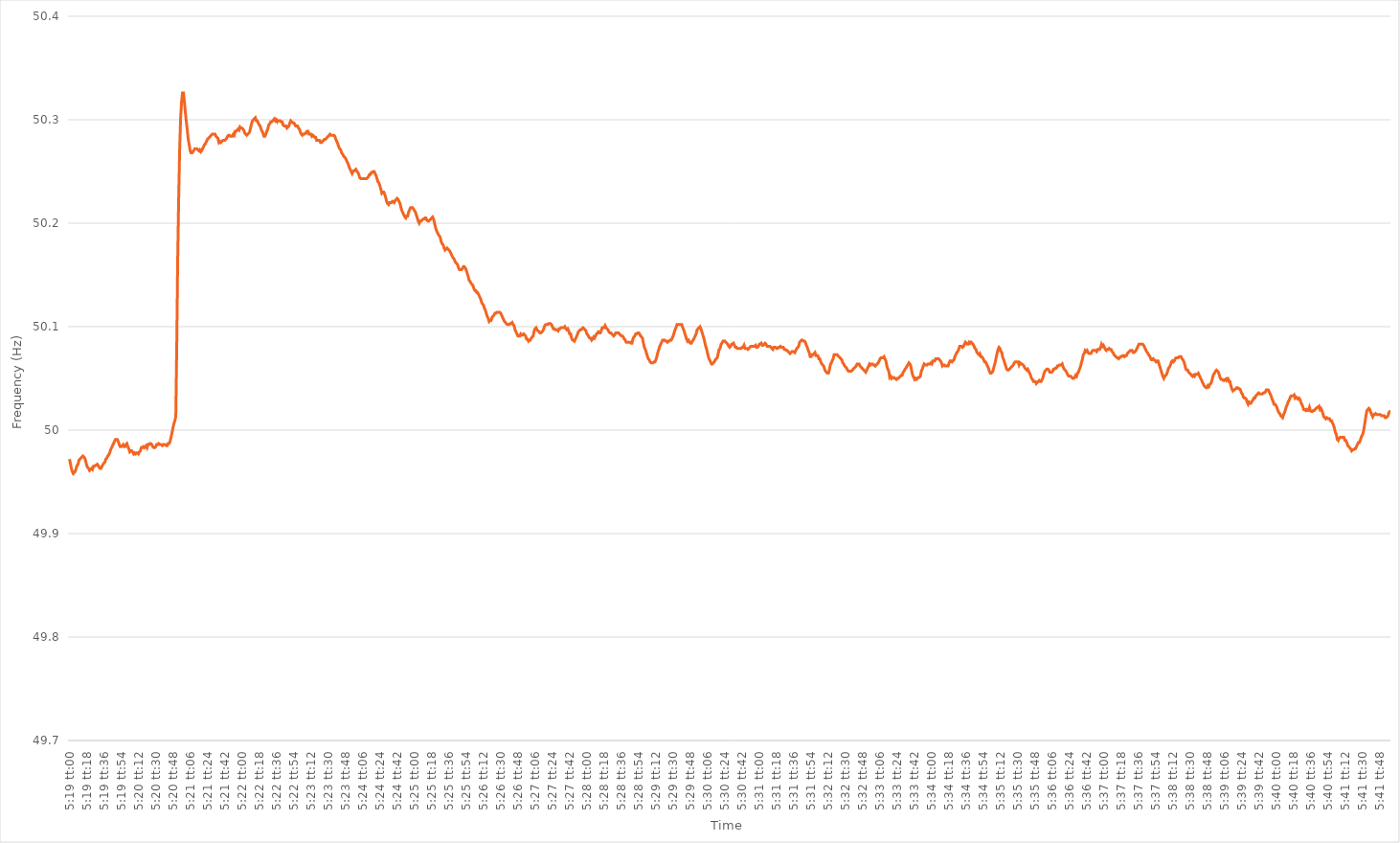
| Category | Series 0 |
|---|---|
| 0.22152777777777777 | 49.972 |
| 0.22153935185185183 | 49.968 |
| 0.22155092592592593 | 49.963 |
| 0.2215625 | 49.96 |
| 0.22157407407407406 | 49.958 |
| 0.22158564814814816 | 49.959 |
| 0.22159722222222222 | 49.96 |
| 0.2216087962962963 | 49.963 |
| 0.22162037037037038 | 49.966 |
| 0.22163194444444445 | 49.967 |
| 0.22164351851851852 | 49.971 |
| 0.2216550925925926 | 49.972 |
| 0.22166666666666668 | 49.973 |
| 0.22167824074074075 | 49.974 |
| 0.22168981481481484 | 49.975 |
| 0.2217013888888889 | 49.974 |
| 0.22171296296296295 | 49.973 |
| 0.221724537037037 | 49.97 |
| 0.2217361111111111 | 49.966 |
| 0.22174768518518517 | 49.964 |
| 0.22175925925925924 | 49.963 |
| 0.22177083333333333 | 49.961 |
| 0.2217824074074074 | 49.962 |
| 0.22179398148148147 | 49.963 |
| 0.22180555555555556 | 49.962 |
| 0.22181712962962963 | 49.965 |
| 0.2218287037037037 | 49.965 |
| 0.2218402777777778 | 49.966 |
| 0.22185185185185186 | 49.966 |
| 0.22186342592592592 | 49.967 |
| 0.22187500000000002 | 49.966 |
| 0.22188657407407408 | 49.964 |
| 0.22189814814814815 | 49.963 |
| 0.22190972222222224 | 49.963 |
| 0.2219212962962963 | 49.965 |
| 0.22193287037037038 | 49.967 |
| 0.22194444444444447 | 49.968 |
| 0.2219560185185185 | 49.969 |
| 0.22196759259259258 | 49.972 |
| 0.22197916666666664 | 49.973 |
| 0.22199074074074074 | 49.975 |
| 0.2220023148148148 | 49.976 |
| 0.22201388888888887 | 49.978 |
| 0.22202546296296297 | 49.981 |
| 0.22203703703703703 | 49.983 |
| 0.2220486111111111 | 49.985 |
| 0.2220601851851852 | 49.987 |
| 0.22207175925925926 | 49.989 |
| 0.22208333333333333 | 49.991 |
| 0.22209490740740742 | 49.991 |
| 0.2221064814814815 | 49.991 |
| 0.22211805555555555 | 49.989 |
| 0.22212962962962965 | 49.986 |
| 0.22214120370370372 | 49.984 |
| 0.22215277777777778 | 49.984 |
| 0.22216435185185188 | 49.985 |
| 0.22217592592592594 | 49.986 |
| 0.22218749999999998 | 49.984 |
| 0.22219907407407405 | 49.984 |
| 0.22221064814814814 | 49.986 |
| 0.2222222222222222 | 49.987 |
| 0.22223379629629628 | 49.984 |
| 0.22224537037037037 | 49.982 |
| 0.22225694444444444 | 49.979 |
| 0.2222685185185185 | 49.98 |
| 0.2222800925925926 | 49.98 |
| 0.22229166666666667 | 49.979 |
| 0.22230324074074073 | 49.977 |
| 0.22231481481481483 | 49.978 |
| 0.2223263888888889 | 49.977 |
| 0.22233796296296296 | 49.978 |
| 0.22234953703703705 | 49.978 |
| 0.22236111111111112 | 49.977 |
| 0.2223726851851852 | 49.979 |
| 0.22238425925925928 | 49.98 |
| 0.22239583333333335 | 49.983 |
| 0.22240740740740741 | 49.983 |
| 0.2224189814814815 | 49.984 |
| 0.22243055555555555 | 49.983 |
| 0.22244212962962961 | 49.984 |
| 0.22245370370370368 | 49.985 |
| 0.22246527777777778 | 49.983 |
| 0.22247685185185184 | 49.986 |
| 0.2224884259259259 | 49.986 |
| 0.2225 | 49.987 |
| 0.22251157407407407 | 49.987 |
| 0.22252314814814814 | 49.986 |
| 0.22253472222222223 | 49.984 |
| 0.2225462962962963 | 49.983 |
| 0.22255787037037036 | 49.983 |
| 0.22256944444444446 | 49.984 |
| 0.22258101851851853 | 49.986 |
| 0.2225925925925926 | 49.986 |
| 0.2226041666666667 | 49.987 |
| 0.22261574074074075 | 49.986 |
| 0.22262731481481482 | 49.986 |
| 0.22263888888888891 | 49.986 |
| 0.22265046296296298 | 49.985 |
| 0.22266203703703702 | 49.986 |
| 0.22267361111111109 | 49.986 |
| 0.22268518518518518 | 49.986 |
| 0.22269675925925925 | 49.985 |
| 0.2227083333333333 | 49.985 |
| 0.2227199074074074 | 49.987 |
| 0.22273148148148147 | 49.987 |
| 0.22274305555555554 | 49.989 |
| 0.22275462962962964 | 49.993 |
| 0.2227662037037037 | 49.997 |
| 0.22277777777777777 | 50.002 |
| 0.22278935185185186 | 50.006 |
| 0.22280092592592593 | 50.009 |
| 0.2228125 | 50.013 |
| 0.2228240740740741 | 50.081 |
| 0.22283564814814816 | 50.166 |
| 0.22284722222222222 | 50.223 |
| 0.22285879629629632 | 50.27 |
| 0.22287037037037039 | 50.301 |
| 0.22288194444444445 | 50.317 |
| 0.2228935185185185 | 50.326 |
| 0.22290509259259259 | 50.326 |
| 0.22291666666666665 | 50.317 |
| 0.22292824074074072 | 50.307 |
| 0.2229398148148148 | 50.298 |
| 0.22295138888888888 | 50.29 |
| 0.22296296296296295 | 50.281 |
| 0.22297453703703704 | 50.276 |
| 0.2229861111111111 | 50.27 |
| 0.22299768518518517 | 50.268 |
| 0.22300925925925927 | 50.268 |
| 0.22302083333333333 | 50.269 |
| 0.2230324074074074 | 50.271 |
| 0.2230439814814815 | 50.272 |
| 0.22305555555555556 | 50.272 |
| 0.22306712962962963 | 50.272 |
| 0.22307870370370372 | 50.271 |
| 0.2230902777777778 | 50.27 |
| 0.22310185185185186 | 50.271 |
| 0.22311342592592595 | 50.269 |
| 0.22312500000000002 | 50.27 |
| 0.22313657407407406 | 50.272 |
| 0.22314814814814812 | 50.274 |
| 0.22315972222222222 | 50.276 |
| 0.22317129629629628 | 50.277 |
| 0.22318287037037035 | 50.279 |
| 0.22319444444444445 | 50.281 |
| 0.2232060185185185 | 50.282 |
| 0.22321759259259258 | 50.283 |
| 0.22322916666666667 | 50.284 |
| 0.22324074074074074 | 50.285 |
| 0.2232523148148148 | 50.286 |
| 0.2232638888888889 | 50.286 |
| 0.22327546296296297 | 50.286 |
| 0.22328703703703703 | 50.286 |
| 0.22329861111111113 | 50.284 |
| 0.2233101851851852 | 50.283 |
| 0.22332175925925926 | 50.282 |
| 0.22333333333333336 | 50.278 |
| 0.22334490740740742 | 50.279 |
| 0.2233564814814815 | 50.278 |
| 0.22336805555555553 | 50.279 |
| 0.22337962962962962 | 50.28 |
| 0.2233912037037037 | 50.28 |
| 0.22340277777777776 | 50.28 |
| 0.22341435185185185 | 50.281 |
| 0.22342592592592592 | 50.282 |
| 0.22343749999999998 | 50.284 |
| 0.22344907407407408 | 50.285 |
| 0.22346064814814814 | 50.285 |
| 0.2234722222222222 | 50.284 |
| 0.2234837962962963 | 50.284 |
| 0.22349537037037037 | 50.284 |
| 0.22350694444444444 | 50.286 |
| 0.22351851851851853 | 50.285 |
| 0.2235300925925926 | 50.289 |
| 0.22354166666666667 | 50.289 |
| 0.22355324074074076 | 50.29 |
| 0.22356481481481483 | 50.291 |
| 0.2235763888888889 | 50.29 |
| 0.223587962962963 | 50.293 |
| 0.22359953703703705 | 50.292 |
| 0.2236111111111111 | 50.292 |
| 0.22362268518518516 | 50.291 |
| 0.22363425925925925 | 50.29 |
| 0.22364583333333332 | 50.287 |
| 0.2236574074074074 | 50.286 |
| 0.22366898148148148 | 50.285 |
| 0.22368055555555555 | 50.286 |
| 0.22369212962962962 | 50.287 |
| 0.2237037037037037 | 50.288 |
| 0.22371527777777778 | 50.292 |
| 0.22372685185185184 | 50.296 |
| 0.22373842592592594 | 50.299 |
| 0.22375 | 50.3 |
| 0.22376157407407407 | 50.301 |
| 0.22377314814814817 | 50.302 |
| 0.22378472222222223 | 50.299 |
| 0.2237962962962963 | 50.299 |
| 0.2238078703703704 | 50.297 |
| 0.22381944444444446 | 50.295 |
| 0.22383101851851853 | 50.294 |
| 0.22384259259259257 | 50.291 |
| 0.22385416666666666 | 50.289 |
| 0.22386574074074073 | 50.287 |
| 0.2238773148148148 | 50.284 |
| 0.2238888888888889 | 50.284 |
| 0.22390046296296295 | 50.286 |
| 0.22391203703703702 | 50.289 |
| 0.22392361111111111 | 50.291 |
| 0.22393518518518518 | 50.295 |
| 0.22394675925925925 | 50.296 |
| 0.22395833333333334 | 50.298 |
| 0.2239699074074074 | 50.298 |
| 0.22398148148148148 | 50.299 |
| 0.22399305555555557 | 50.3 |
| 0.22400462962962964 | 50.301 |
| 0.2240162037037037 | 50.299 |
| 0.2240277777777778 | 50.3 |
| 0.22403935185185186 | 50.298 |
| 0.22405092592592593 | 50.299 |
| 0.22406250000000003 | 50.299 |
| 0.2240740740740741 | 50.299 |
| 0.22408564814814813 | 50.298 |
| 0.2240972222222222 | 50.298 |
| 0.2241087962962963 | 50.295 |
| 0.22412037037037036 | 50.294 |
| 0.22413194444444443 | 50.294 |
| 0.22414351851851852 | 50.294 |
| 0.2241550925925926 | 50.292 |
| 0.22416666666666665 | 50.293 |
| 0.22417824074074075 | 50.294 |
| 0.22418981481481481 | 50.297 |
| 0.22420138888888888 | 50.299 |
| 0.22421296296296298 | 50.298 |
| 0.22422453703703704 | 50.297 |
| 0.2242361111111111 | 50.297 |
| 0.2242476851851852 | 50.296 |
| 0.22425925925925927 | 50.294 |
| 0.22427083333333334 | 50.294 |
| 0.22428240740740743 | 50.294 |
| 0.2242939814814815 | 50.292 |
| 0.22430555555555556 | 50.291 |
| 0.2243171296296296 | 50.288 |
| 0.2243287037037037 | 50.286 |
| 0.22434027777777776 | 50.285 |
| 0.22435185185185183 | 50.286 |
| 0.22436342592592592 | 50.286 |
| 0.224375 | 50.287 |
| 0.22438657407407406 | 50.287 |
| 0.22439814814814815 | 50.289 |
| 0.22440972222222222 | 50.289 |
| 0.22442129629629629 | 50.286 |
| 0.22443287037037038 | 50.286 |
| 0.22444444444444445 | 50.286 |
| 0.2244560185185185 | 50.284 |
| 0.2244675925925926 | 50.285 |
| 0.22447916666666667 | 50.284 |
| 0.22449074074074074 | 50.283 |
| 0.22450231481481484 | 50.283 |
| 0.2245138888888889 | 50.28 |
| 0.22452546296296297 | 50.28 |
| 0.22453703703703706 | 50.28 |
| 0.22454861111111113 | 50.28 |
| 0.22456018518518517 | 50.278 |
| 0.22457175925925923 | 50.278 |
| 0.22458333333333333 | 50.279 |
| 0.2245949074074074 | 50.28 |
| 0.22460648148148146 | 50.281 |
| 0.22461805555555556 | 50.281 |
| 0.22462962962962962 | 50.282 |
| 0.2246412037037037 | 50.283 |
| 0.22465277777777778 | 50.284 |
| 0.22466435185185185 | 50.285 |
| 0.22467592592592592 | 50.286 |
| 0.2246875 | 50.285 |
| 0.22469907407407408 | 50.285 |
| 0.22471064814814815 | 50.285 |
| 0.22472222222222224 | 50.285 |
| 0.2247337962962963 | 50.284 |
| 0.22474537037037037 | 50.281 |
| 0.22475694444444447 | 50.279 |
| 0.22476851851851853 | 50.277 |
| 0.2247800925925926 | 50.274 |
| 0.22479166666666664 | 50.272 |
| 0.22480324074074073 | 50.271 |
| 0.2248148148148148 | 50.268 |
| 0.22482638888888887 | 50.267 |
| 0.22483796296296296 | 50.265 |
| 0.22484953703703703 | 50.264 |
| 0.2248611111111111 | 50.263 |
| 0.2248726851851852 | 50.261 |
| 0.22488425925925926 | 50.259 |
| 0.22489583333333332 | 50.257 |
| 0.22490740740740742 | 50.254 |
| 0.22491898148148148 | 50.252 |
| 0.22493055555555555 | 50.25 |
| 0.22494212962962964 | 50.248 |
| 0.2249537037037037 | 50.25 |
| 0.22496527777777778 | 50.251 |
| 0.22497685185185187 | 50.251 |
| 0.22498842592592594 | 50.252 |
| 0.225 | 50.25 |
| 0.2250115740740741 | 50.249 |
| 0.22502314814814817 | 50.247 |
| 0.2250347222222222 | 50.244 |
| 0.22504629629629627 | 50.243 |
| 0.22505787037037037 | 50.243 |
| 0.22506944444444443 | 50.243 |
| 0.2250810185185185 | 50.243 |
| 0.2250925925925926 | 50.243 |
| 0.22510416666666666 | 50.243 |
| 0.22511574074074073 | 50.243 |
| 0.22512731481481482 | 50.244 |
| 0.2251388888888889 | 50.245 |
| 0.22515046296296296 | 50.247 |
| 0.22516203703703705 | 50.247 |
| 0.22517361111111112 | 50.249 |
| 0.22518518518518518 | 50.249 |
| 0.22519675925925928 | 50.25 |
| 0.22520833333333334 | 50.25 |
| 0.2252199074074074 | 50.248 |
| 0.2252314814814815 | 50.246 |
| 0.22524305555555557 | 50.243 |
| 0.22525462962962964 | 50.24 |
| 0.22526620370370368 | 50.239 |
| 0.22527777777777777 | 50.236 |
| 0.22528935185185184 | 50.233 |
| 0.2253009259259259 | 50.229 |
| 0.2253125 | 50.23 |
| 0.22532407407407407 | 50.23 |
| 0.22533564814814813 | 50.228 |
| 0.22534722222222223 | 50.225 |
| 0.2253587962962963 | 50.221 |
| 0.22537037037037036 | 50.219 |
| 0.22538194444444445 | 50.218 |
| 0.22539351851851852 | 50.22 |
| 0.2254050925925926 | 50.22 |
| 0.22541666666666668 | 50.22 |
| 0.22542824074074075 | 50.221 |
| 0.22543981481481482 | 50.221 |
| 0.2254513888888889 | 50.22 |
| 0.22546296296296298 | 50.222 |
| 0.22547453703703704 | 50.223 |
| 0.22548611111111114 | 50.224 |
| 0.22549768518518518 | 50.223 |
| 0.22550925925925924 | 50.221 |
| 0.2255208333333333 | 50.219 |
| 0.2255324074074074 | 50.215 |
| 0.22554398148148147 | 50.212 |
| 0.22555555555555554 | 50.21 |
| 0.22556712962962963 | 50.208 |
| 0.2255787037037037 | 50.206 |
| 0.22559027777777776 | 50.205 |
| 0.22560185185185186 | 50.207 |
| 0.22561342592592593 | 50.207 |
| 0.225625 | 50.211 |
| 0.2256365740740741 | 50.213 |
| 0.22564814814814815 | 50.215 |
| 0.22565972222222222 | 50.215 |
| 0.22567129629629631 | 50.215 |
| 0.22568287037037038 | 50.214 |
| 0.22569444444444445 | 50.212 |
| 0.22570601851851854 | 50.211 |
| 0.2257175925925926 | 50.208 |
| 0.22572916666666668 | 50.205 |
| 0.22574074074074071 | 50.202 |
| 0.2257523148148148 | 50.2 |
| 0.22576388888888888 | 50.202 |
| 0.22577546296296294 | 50.202 |
| 0.22578703703703704 | 50.203 |
| 0.2257986111111111 | 50.204 |
| 0.22581018518518517 | 50.204 |
| 0.22582175925925926 | 50.205 |
| 0.22583333333333333 | 50.205 |
| 0.2258449074074074 | 50.203 |
| 0.2258564814814815 | 50.202 |
| 0.22586805555555556 | 50.202 |
| 0.22587962962962962 | 50.203 |
| 0.22589120370370372 | 50.204 |
| 0.22590277777777779 | 50.205 |
| 0.22591435185185185 | 50.206 |
| 0.22592592592592595 | 50.204 |
| 0.2259375 | 50.2 |
| 0.22594907407407408 | 50.196 |
| 0.22596064814814817 | 50.193 |
| 0.2259722222222222 | 50.191 |
| 0.22598379629629628 | 50.189 |
| 0.22599537037037035 | 50.188 |
| 0.22600694444444444 | 50.186 |
| 0.2260185185185185 | 50.182 |
| 0.22603009259259257 | 50.18 |
| 0.22604166666666667 | 50.179 |
| 0.22605324074074074 | 50.176 |
| 0.2260648148148148 | 50.174 |
| 0.2260763888888889 | 50.175 |
| 0.22608796296296296 | 50.176 |
| 0.22609953703703703 | 50.175 |
| 0.22611111111111112 | 50.174 |
| 0.2261226851851852 | 50.173 |
| 0.22613425925925926 | 50.171 |
| 0.22614583333333335 | 50.169 |
| 0.22615740740740742 | 50.167 |
| 0.22616898148148148 | 50.166 |
| 0.22618055555555558 | 50.164 |
| 0.22619212962962965 | 50.162 |
| 0.2262037037037037 | 50.161 |
| 0.22621527777777775 | 50.16 |
| 0.22622685185185185 | 50.157 |
| 0.2262384259259259 | 50.155 |
| 0.22624999999999998 | 50.155 |
| 0.22626157407407407 | 50.155 |
| 0.22627314814814814 | 50.156 |
| 0.2262847222222222 | 50.158 |
| 0.2262962962962963 | 50.158 |
| 0.22630787037037037 | 50.157 |
| 0.22631944444444443 | 50.155 |
| 0.22633101851851853 | 50.152 |
| 0.2263425925925926 | 50.149 |
| 0.22635416666666666 | 50.145 |
| 0.22636574074074076 | 50.144 |
| 0.22637731481481482 | 50.142 |
| 0.2263888888888889 | 50.141 |
| 0.22640046296296298 | 50.14 |
| 0.22641203703703705 | 50.137 |
| 0.22642361111111112 | 50.135 |
| 0.2264351851851852 | 50.135 |
| 0.22644675925925925 | 50.133 |
| 0.22645833333333332 | 50.133 |
| 0.22646990740740738 | 50.131 |
| 0.22648148148148148 | 50.129 |
| 0.22649305555555554 | 50.127 |
| 0.2265046296296296 | 50.124 |
| 0.2265162037037037 | 50.122 |
| 0.22652777777777777 | 50.121 |
| 0.22653935185185184 | 50.118 |
| 0.22655092592592593 | 50.116 |
| 0.2265625 | 50.113 |
| 0.22657407407407407 | 50.11 |
| 0.22658564814814816 | 50.108 |
| 0.22659722222222223 | 50.105 |
| 0.2266087962962963 | 50.106 |
| 0.2266203703703704 | 50.106 |
| 0.22663194444444446 | 50.109 |
| 0.22664351851851852 | 50.11 |
| 0.22665509259259262 | 50.111 |
| 0.22666666666666668 | 50.113 |
| 0.22667824074074075 | 50.113 |
| 0.2266898148148148 | 50.114 |
| 0.22670138888888888 | 50.114 |
| 0.22671296296296295 | 50.114 |
| 0.22672453703703702 | 50.114 |
| 0.2267361111111111 | 50.113 |
| 0.22674768518518518 | 50.111 |
| 0.22675925925925924 | 50.109 |
| 0.22677083333333334 | 50.107 |
| 0.2267824074074074 | 50.105 |
| 0.22679398148148147 | 50.104 |
| 0.22680555555555557 | 50.103 |
| 0.22681712962962963 | 50.102 |
| 0.2268287037037037 | 50.102 |
| 0.2268402777777778 | 50.102 |
| 0.22685185185185186 | 50.103 |
| 0.22686342592592593 | 50.103 |
| 0.22687500000000002 | 50.104 |
| 0.2268865740740741 | 50.102 |
| 0.22689814814814815 | 50.101 |
| 0.22690972222222225 | 50.097 |
| 0.2269212962962963 | 50.095 |
| 0.22693287037037035 | 50.093 |
| 0.22694444444444442 | 50.091 |
| 0.22695601851851852 | 50.091 |
| 0.22696759259259258 | 50.091 |
| 0.22697916666666665 | 50.093 |
| 0.22699074074074074 | 50.092 |
| 0.2270023148148148 | 50.092 |
| 0.22701388888888888 | 50.093 |
| 0.22702546296296297 | 50.092 |
| 0.22703703703703704 | 50.091 |
| 0.2270486111111111 | 50.088 |
| 0.2270601851851852 | 50.088 |
| 0.22707175925925926 | 50.086 |
| 0.22708333333333333 | 50.087 |
| 0.22709490740740743 | 50.087 |
| 0.2271064814814815 | 50.089 |
| 0.22711805555555556 | 50.09 |
| 0.22712962962962965 | 50.091 |
| 0.22714120370370372 | 50.096 |
| 0.2271527777777778 | 50.098 |
| 0.22716435185185183 | 50.099 |
| 0.22717592592592592 | 50.097 |
| 0.2271875 | 50.096 |
| 0.22719907407407405 | 50.095 |
| 0.22721064814814815 | 50.094 |
| 0.22722222222222221 | 50.094 |
| 0.22723379629629628 | 50.095 |
| 0.22724537037037038 | 50.096 |
| 0.22725694444444444 | 50.098 |
| 0.2272685185185185 | 50.101 |
| 0.2272800925925926 | 50.102 |
| 0.22729166666666667 | 50.102 |
| 0.22730324074074074 | 50.102 |
| 0.22731481481481483 | 50.103 |
| 0.2273263888888889 | 50.103 |
| 0.22733796296296296 | 50.103 |
| 0.22734953703703706 | 50.102 |
| 0.22736111111111112 | 50.1 |
| 0.2273726851851852 | 50.098 |
| 0.22738425925925929 | 50.098 |
| 0.22739583333333332 | 50.097 |
| 0.2274074074074074 | 50.097 |
| 0.22741898148148146 | 50.097 |
| 0.22743055555555555 | 50.096 |
| 0.22744212962962962 | 50.098 |
| 0.22745370370370369 | 50.098 |
| 0.22746527777777778 | 50.099 |
| 0.22747685185185185 | 50.099 |
| 0.2274884259259259 | 50.099 |
| 0.2275 | 50.099 |
| 0.22751157407407407 | 50.1 |
| 0.22752314814814814 | 50.098 |
| 0.22753472222222224 | 50.097 |
| 0.2275462962962963 | 50.098 |
| 0.22755787037037037 | 50.096 |
| 0.22756944444444446 | 50.093 |
| 0.22758101851851853 | 50.093 |
| 0.2275925925925926 | 50.089 |
| 0.2276041666666667 | 50.087 |
| 0.22761574074074076 | 50.087 |
| 0.22762731481481482 | 50.086 |
| 0.22763888888888886 | 50.088 |
| 0.22765046296296296 | 50.09 |
| 0.22766203703703702 | 50.092 |
| 0.2276736111111111 | 50.095 |
| 0.22768518518518518 | 50.096 |
| 0.22769675925925925 | 50.097 |
| 0.22770833333333332 | 50.097 |
| 0.2277199074074074 | 50.098 |
| 0.22773148148148148 | 50.099 |
| 0.22774305555555555 | 50.098 |
| 0.22775462962962964 | 50.097 |
| 0.2277662037037037 | 50.096 |
| 0.22777777777777777 | 50.093 |
| 0.22778935185185187 | 50.092 |
| 0.22780092592592593 | 50.09 |
| 0.2278125 | 50.089 |
| 0.2278240740740741 | 50.089 |
| 0.22783564814814816 | 50.087 |
| 0.22784722222222223 | 50.088 |
| 0.22785879629629632 | 50.09 |
| 0.22787037037037036 | 50.089 |
| 0.22788194444444443 | 50.091 |
| 0.2278935185185185 | 50.093 |
| 0.2279050925925926 | 50.094 |
| 0.22791666666666666 | 50.095 |
| 0.22792824074074072 | 50.094 |
| 0.22793981481481482 | 50.094 |
| 0.22795138888888888 | 50.096 |
| 0.22796296296296295 | 50.099 |
| 0.22797453703703704 | 50.099 |
| 0.2279861111111111 | 50.099 |
| 0.22799768518518518 | 50.101 |
| 0.22800925925925927 | 50.099 |
| 0.22802083333333334 | 50.098 |
| 0.2280324074074074 | 50.097 |
| 0.2280439814814815 | 50.095 |
| 0.22805555555555557 | 50.094 |
| 0.22806712962962963 | 50.094 |
| 0.22807870370370373 | 50.093 |
| 0.2280902777777778 | 50.092 |
| 0.22810185185185183 | 50.091 |
| 0.2281134259259259 | 50.092 |
| 0.228125 | 50.094 |
| 0.22813657407407406 | 50.094 |
| 0.22814814814814813 | 50.094 |
| 0.22815972222222222 | 50.094 |
| 0.2281712962962963 | 50.093 |
| 0.22818287037037036 | 50.092 |
| 0.22819444444444445 | 50.091 |
| 0.22820601851851852 | 50.091 |
| 0.22821759259259258 | 50.09 |
| 0.22822916666666668 | 50.088 |
| 0.22824074074074074 | 50.087 |
| 0.2282523148148148 | 50.085 |
| 0.2282638888888889 | 50.085 |
| 0.22827546296296297 | 50.085 |
| 0.22828703703703704 | 50.085 |
| 0.22829861111111113 | 50.085 |
| 0.2283101851851852 | 50.084 |
| 0.22832175925925927 | 50.084 |
| 0.22833333333333336 | 50.088 |
| 0.2283449074074074 | 50.09 |
| 0.22835648148148147 | 50.091 |
| 0.22836805555555553 | 50.093 |
| 0.22837962962962963 | 50.093 |
| 0.2283912037037037 | 50.094 |
| 0.22840277777777776 | 50.094 |
| 0.22841435185185185 | 50.093 |
| 0.22842592592592592 | 50.091 |
| 0.2284375 | 50.09 |
| 0.22844907407407408 | 50.089 |
| 0.22846064814814815 | 50.084 |
| 0.22847222222222222 | 50.08 |
| 0.2284837962962963 | 50.078 |
| 0.22849537037037038 | 50.075 |
| 0.22850694444444444 | 50.072 |
| 0.22851851851851854 | 50.069 |
| 0.2285300925925926 | 50.068 |
| 0.22854166666666667 | 50.066 |
| 0.22855324074074077 | 50.065 |
| 0.22856481481481483 | 50.065 |
| 0.22857638888888887 | 50.065 |
| 0.22858796296296294 | 50.066 |
| 0.22859953703703703 | 50.066 |
| 0.2286111111111111 | 50.068 |
| 0.22862268518518516 | 50.071 |
| 0.22863425925925926 | 50.075 |
| 0.22864583333333333 | 50.078 |
| 0.2286574074074074 | 50.081 |
| 0.2286689814814815 | 50.083 |
| 0.22868055555555555 | 50.085 |
| 0.22869212962962962 | 50.087 |
| 0.22870370370370371 | 50.087 |
| 0.22871527777777778 | 50.087 |
| 0.22872685185185185 | 50.086 |
| 0.22873842592592594 | 50.086 |
| 0.22875 | 50.085 |
| 0.22876157407407408 | 50.086 |
| 0.22877314814814817 | 50.086 |
| 0.22878472222222224 | 50.087 |
| 0.2287962962962963 | 50.087 |
| 0.2288078703703704 | 50.089 |
| 0.22881944444444444 | 50.091 |
| 0.2288310185185185 | 50.094 |
| 0.22884259259259257 | 50.097 |
| 0.22885416666666666 | 50.099 |
| 0.22886574074074073 | 50.102 |
| 0.2288773148148148 | 50.102 |
| 0.2288888888888889 | 50.102 |
| 0.22890046296296296 | 50.102 |
| 0.22891203703703702 | 50.102 |
| 0.22892361111111112 | 50.102 |
| 0.22893518518518519 | 50.099 |
| 0.22894675925925925 | 50.097 |
| 0.22895833333333335 | 50.094 |
| 0.2289699074074074 | 50.091 |
| 0.22898148148148148 | 50.088 |
| 0.22899305555555557 | 50.086 |
| 0.22900462962962964 | 50.087 |
| 0.2290162037037037 | 50.085 |
| 0.2290277777777778 | 50.084 |
| 0.22903935185185187 | 50.084 |
| 0.2290509259259259 | 50.086 |
| 0.22906249999999997 | 50.087 |
| 0.22907407407407407 | 50.089 |
| 0.22908564814814814 | 50.091 |
| 0.2290972222222222 | 50.093 |
| 0.2291087962962963 | 50.097 |
| 0.22912037037037036 | 50.098 |
| 0.22913194444444443 | 50.099 |
| 0.22914351851851852 | 50.1 |
| 0.2291550925925926 | 50.098 |
| 0.22916666666666666 | 50.095 |
| 0.22917824074074075 | 50.092 |
| 0.22918981481481482 | 50.089 |
| 0.22920138888888889 | 50.085 |
| 0.22921296296296298 | 50.081 |
| 0.22922453703703705 | 50.078 |
| 0.2292361111111111 | 50.074 |
| 0.2292476851851852 | 50.07 |
| 0.22925925925925927 | 50.068 |
| 0.2292708333333333 | 50.066 |
| 0.22928240740740743 | 50.064 |
| 0.22929398148148147 | 50.064 |
| 0.22930555555555554 | 50.065 |
| 0.2293171296296296 | 50.066 |
| 0.2293287037037037 | 50.068 |
| 0.22934027777777777 | 50.069 |
| 0.22935185185185183 | 50.07 |
| 0.22936342592592593 | 50.074 |
| 0.229375 | 50.078 |
| 0.22938657407407406 | 50.079 |
| 0.22939814814814816 | 50.083 |
| 0.22940972222222222 | 50.084 |
| 0.2294212962962963 | 50.086 |
| 0.22943287037037038 | 50.086 |
| 0.22944444444444445 | 50.086 |
| 0.22945601851851852 | 50.085 |
| 0.2294675925925926 | 50.084 |
| 0.22947916666666668 | 50.083 |
| 0.22949074074074075 | 50.081 |
| 0.22950231481481484 | 50.08 |
| 0.22951388888888888 | 50.081 |
| 0.22952546296296297 | 50.083 |
| 0.229537037037037 | 50.083 |
| 0.2295486111111111 | 50.084 |
| 0.22956018518518517 | 50.082 |
| 0.22957175925925924 | 50.08 |
| 0.22958333333333333 | 50.08 |
| 0.2295949074074074 | 50.079 |
| 0.22960648148148147 | 50.079 |
| 0.22961805555555556 | 50.079 |
| 0.22962962962962963 | 50.079 |
| 0.2296412037037037 | 50.079 |
| 0.2296527777777778 | 50.08 |
| 0.22966435185185186 | 50.08 |
| 0.22967592592592592 | 50.082 |
| 0.22968750000000002 | 50.079 |
| 0.22969907407407408 | 50.079 |
| 0.22971064814814815 | 50.079 |
| 0.22972222222222224 | 50.078 |
| 0.2297337962962963 | 50.079 |
| 0.22974537037037038 | 50.08 |
| 0.22975694444444442 | 50.081 |
| 0.22976851851851854 | 50.081 |
| 0.22978009259259258 | 50.081 |
| 0.22979166666666664 | 50.081 |
| 0.22980324074074074 | 50.081 |
| 0.2298148148148148 | 50.082 |
| 0.22982638888888887 | 50.08 |
| 0.22983796296296297 | 50.08 |
| 0.22984953703703703 | 50.081 |
| 0.2298611111111111 | 50.083 |
| 0.2298726851851852 | 50.083 |
| 0.22988425925925926 | 50.084 |
| 0.22989583333333333 | 50.082 |
| 0.22990740740740742 | 50.082 |
| 0.2299189814814815 | 50.083 |
| 0.22993055555555555 | 50.084 |
| 0.22994212962962965 | 50.083 |
| 0.22995370370370372 | 50.081 |
| 0.22996527777777778 | 50.081 |
| 0.22997685185185188 | 50.081 |
| 0.22998842592592594 | 50.081 |
| 0.22999999999999998 | 50.08 |
| 0.23001157407407405 | 50.079 |
| 0.23002314814814814 | 50.078 |
| 0.2300347222222222 | 50.08 |
| 0.23004629629629628 | 50.08 |
| 0.23005787037037037 | 50.08 |
| 0.23006944444444444 | 50.079 |
| 0.2300810185185185 | 50.079 |
| 0.2300925925925926 | 50.08 |
| 0.23010416666666667 | 50.08 |
| 0.23011574074074073 | 50.081 |
| 0.23012731481481483 | 50.08 |
| 0.2301388888888889 | 50.08 |
| 0.23015046296296296 | 50.08 |
| 0.23016203703703705 | 50.078 |
| 0.23017361111111112 | 50.078 |
| 0.2301851851851852 | 50.077 |
| 0.23019675925925928 | 50.077 |
| 0.23020833333333335 | 50.076 |
| 0.2302199074074074 | 50.075 |
| 0.2302314814814815 | 50.074 |
| 0.23024305555555555 | 50.075 |
| 0.23025462962962961 | 50.076 |
| 0.23026620370370368 | 50.076 |
| 0.23027777777777778 | 50.076 |
| 0.23028935185185184 | 50.075 |
| 0.2303009259259259 | 50.077 |
| 0.2303125 | 50.079 |
| 0.23032407407407407 | 50.08 |
| 0.23033564814814814 | 50.081 |
| 0.23034722222222223 | 50.085 |
| 0.2303587962962963 | 50.086 |
| 0.23037037037037036 | 50.087 |
| 0.23038194444444446 | 50.087 |
| 0.23039351851851853 | 50.086 |
| 0.2304050925925926 | 50.086 |
| 0.2304166666666667 | 50.085 |
| 0.23042824074074075 | 50.082 |
| 0.23043981481481482 | 50.08 |
| 0.23045138888888891 | 50.077 |
| 0.23046296296296295 | 50.075 |
| 0.23047453703703705 | 50.071 |
| 0.23048611111111109 | 50.071 |
| 0.23049768518518518 | 50.073 |
| 0.23050925925925925 | 50.073 |
| 0.2305208333333333 | 50.074 |
| 0.2305324074074074 | 50.075 |
| 0.23054398148148147 | 50.072 |
| 0.23055555555555554 | 50.072 |
| 0.23056712962962964 | 50.072 |
| 0.2305787037037037 | 50.069 |
| 0.23059027777777777 | 50.069 |
| 0.23060185185185186 | 50.066 |
| 0.23061342592592593 | 50.064 |
| 0.230625 | 50.063 |
| 0.2306365740740741 | 50.062 |
| 0.23064814814814816 | 50.059 |
| 0.23065972222222222 | 50.057 |
| 0.23067129629629632 | 50.056 |
| 0.23068287037037036 | 50.055 |
| 0.23069444444444445 | 50.055 |
| 0.2307060185185185 | 50.058 |
| 0.2307175925925926 | 50.063 |
| 0.23072916666666665 | 50.065 |
| 0.23074074074074072 | 50.067 |
| 0.2307523148148148 | 50.069 |
| 0.23076388888888888 | 50.073 |
| 0.23077546296296295 | 50.073 |
| 0.23078703703703704 | 50.073 |
| 0.2307986111111111 | 50.073 |
| 0.23081018518518517 | 50.072 |
| 0.23082175925925927 | 50.071 |
| 0.23083333333333333 | 50.07 |
| 0.2308449074074074 | 50.069 |
| 0.2308564814814815 | 50.068 |
| 0.23086805555555556 | 50.065 |
| 0.23087962962962963 | 50.064 |
| 0.23089120370370372 | 50.062 |
| 0.2309027777777778 | 50.061 |
| 0.23091435185185186 | 50.06 |
| 0.2309259259259259 | 50.058 |
| 0.23093750000000002 | 50.057 |
| 0.23094907407407406 | 50.057 |
| 0.23096064814814818 | 50.057 |
| 0.23097222222222222 | 50.057 |
| 0.23098379629629628 | 50.058 |
| 0.23099537037037035 | 50.059 |
| 0.23100694444444445 | 50.06 |
| 0.2310185185185185 | 50.061 |
| 0.23103009259259258 | 50.062 |
| 0.23104166666666667 | 50.064 |
| 0.23105324074074074 | 50.064 |
| 0.2310648148148148 | 50.064 |
| 0.2310763888888889 | 50.062 |
| 0.23108796296296297 | 50.061 |
| 0.23109953703703703 | 50.06 |
| 0.23111111111111113 | 50.059 |
| 0.2311226851851852 | 50.058 |
| 0.23113425925925926 | 50.057 |
| 0.23114583333333336 | 50.056 |
| 0.23115740740740742 | 50.058 |
| 0.23116898148148146 | 50.06 |
| 0.23118055555555558 | 50.062 |
| 0.23119212962962962 | 50.064 |
| 0.2312037037037037 | 50.063 |
| 0.23121527777777776 | 50.064 |
| 0.23122685185185185 | 50.064 |
| 0.23123842592592592 | 50.063 |
| 0.23124999999999998 | 50.063 |
| 0.23126157407407408 | 50.062 |
| 0.23127314814814814 | 50.063 |
| 0.2312847222222222 | 50.064 |
| 0.2312962962962963 | 50.065 |
| 0.23130787037037037 | 50.067 |
| 0.23131944444444444 | 50.069 |
| 0.23133101851851853 | 50.07 |
| 0.2313425925925926 | 50.07 |
| 0.23135416666666667 | 50.07 |
| 0.23136574074074076 | 50.071 |
| 0.23137731481481483 | 50.069 |
| 0.2313888888888889 | 50.067 |
| 0.231400462962963 | 50.062 |
| 0.23141203703703703 | 50.059 |
| 0.23142361111111112 | 50.057 |
| 0.23143518518518516 | 50.051 |
| 0.23144675925925925 | 50.052 |
| 0.23145833333333332 | 50.05 |
| 0.2314699074074074 | 50.051 |
| 0.23148148148148148 | 50.051 |
| 0.23149305555555555 | 50.05 |
| 0.23150462962962962 | 50.05 |
| 0.2315162037037037 | 50.049 |
| 0.23152777777777778 | 50.05 |
| 0.23153935185185184 | 50.05 |
| 0.23155092592592594 | 50.051 |
| 0.2315625 | 50.052 |
| 0.23157407407407407 | 50.053 |
| 0.23158564814814817 | 50.053 |
| 0.23159722222222223 | 50.056 |
| 0.2316087962962963 | 50.057 |
| 0.2316203703703704 | 50.059 |
| 0.23163194444444443 | 50.06 |
| 0.23164351851851853 | 50.062 |
| 0.23165509259259257 | 50.063 |
| 0.2316666666666667 | 50.065 |
| 0.23167824074074073 | 50.064 |
| 0.2316898148148148 | 50.062 |
| 0.2317013888888889 | 50.057 |
| 0.23171296296296295 | 50.053 |
| 0.23172453703703702 | 50.051 |
| 0.23173611111111111 | 50.049 |
| 0.23174768518518518 | 50.05 |
| 0.23175925925925925 | 50.049 |
| 0.23177083333333334 | 50.05 |
| 0.2317824074074074 | 50.051 |
| 0.23179398148148148 | 50.051 |
| 0.23180555555555557 | 50.052 |
| 0.23181712962962964 | 50.057 |
| 0.2318287037037037 | 50.059 |
| 0.2318402777777778 | 50.062 |
| 0.23185185185185186 | 50.064 |
| 0.23186342592592593 | 50.063 |
| 0.23187499999999997 | 50.063 |
| 0.2318865740740741 | 50.063 |
| 0.23189814814814813 | 50.064 |
| 0.23190972222222225 | 50.064 |
| 0.2319212962962963 | 50.064 |
| 0.23193287037037036 | 50.065 |
| 0.23194444444444443 | 50.064 |
| 0.23195601851851852 | 50.067 |
| 0.2319675925925926 | 50.067 |
| 0.23197916666666665 | 50.067 |
| 0.23199074074074075 | 50.069 |
| 0.23200231481481481 | 50.069 |
| 0.23201388888888888 | 50.069 |
| 0.23202546296296298 | 50.069 |
| 0.23203703703703704 | 50.068 |
| 0.2320486111111111 | 50.067 |
| 0.2320601851851852 | 50.065 |
| 0.23207175925925927 | 50.062 |
| 0.23208333333333334 | 50.063 |
| 0.23209490740740743 | 50.063 |
| 0.2321064814814815 | 50.062 |
| 0.23211805555555554 | 50.062 |
| 0.23212962962962966 | 50.062 |
| 0.2321412037037037 | 50.062 |
| 0.23215277777777776 | 50.065 |
| 0.23216435185185183 | 50.067 |
| 0.23217592592592592 | 50.067 |
| 0.2321875 | 50.066 |
| 0.23219907407407406 | 50.067 |
| 0.23221064814814815 | 50.068 |
| 0.23222222222222222 | 50.071 |
| 0.23223379629629629 | 50.073 |
| 0.23224537037037038 | 50.075 |
| 0.23225694444444445 | 50.076 |
| 0.2322685185185185 | 50.078 |
| 0.2322800925925926 | 50.081 |
| 0.23229166666666667 | 50.081 |
| 0.23230324074074074 | 50.081 |
| 0.23231481481481484 | 50.08 |
| 0.2323263888888889 | 50.081 |
| 0.23233796296296297 | 50.083 |
| 0.23234953703703706 | 50.085 |
| 0.2323611111111111 | 50.084 |
| 0.2323726851851852 | 50.083 |
| 0.23238425925925923 | 50.083 |
| 0.23239583333333333 | 50.085 |
| 0.2324074074074074 | 50.084 |
| 0.23241898148148146 | 50.085 |
| 0.23243055555555556 | 50.084 |
| 0.23244212962962962 | 50.083 |
| 0.2324537037037037 | 50.081 |
| 0.23246527777777778 | 50.079 |
| 0.23247685185185185 | 50.078 |
| 0.23248842592592592 | 50.075 |
| 0.2325 | 50.074 |
| 0.23251157407407408 | 50.073 |
| 0.23252314814814815 | 50.074 |
| 0.23253472222222224 | 50.071 |
| 0.2325462962962963 | 50.071 |
| 0.23255787037037037 | 50.07 |
| 0.23256944444444447 | 50.068 |
| 0.2325810185185185 | 50.066 |
| 0.2325925925925926 | 50.066 |
| 0.23260416666666664 | 50.064 |
| 0.23261574074074076 | 50.062 |
| 0.2326273148148148 | 50.06 |
| 0.23263888888888887 | 50.057 |
| 0.23265046296296296 | 50.055 |
| 0.23266203703703703 | 50.055 |
| 0.2326736111111111 | 50.056 |
| 0.2326851851851852 | 50.058 |
| 0.23269675925925926 | 50.062 |
| 0.23270833333333332 | 50.065 |
| 0.23271990740740742 | 50.07 |
| 0.23273148148148148 | 50.074 |
| 0.23274305555555555 | 50.078 |
| 0.23275462962962964 | 50.08 |
| 0.2327662037037037 | 50.079 |
| 0.23277777777777778 | 50.076 |
| 0.23278935185185187 | 50.075 |
| 0.23280092592592594 | 50.07 |
| 0.2328125 | 50.068 |
| 0.23282407407407404 | 50.065 |
| 0.23283564814814817 | 50.062 |
| 0.2328472222222222 | 50.059 |
| 0.23285879629629633 | 50.058 |
| 0.23287037037037037 | 50.058 |
| 0.23288194444444443 | 50.059 |
| 0.2328935185185185 | 50.06 |
| 0.2329050925925926 | 50.061 |
| 0.23291666666666666 | 50.062 |
| 0.23292824074074073 | 50.063 |
| 0.23293981481481482 | 50.065 |
| 0.2329513888888889 | 50.066 |
| 0.23296296296296296 | 50.066 |
| 0.23297453703703705 | 50.066 |
| 0.23298611111111112 | 50.066 |
| 0.23299768518518518 | 50.063 |
| 0.23300925925925928 | 50.065 |
| 0.23302083333333334 | 50.064 |
| 0.2330324074074074 | 50.064 |
| 0.2330439814814815 | 50.063 |
| 0.23305555555555557 | 50.062 |
| 0.2330671296296296 | 50.06 |
| 0.23307870370370373 | 50.059 |
| 0.23309027777777777 | 50.058 |
| 0.23310185185185184 | 50.059 |
| 0.2331134259259259 | 50.057 |
| 0.233125 | 50.055 |
| 0.23313657407407407 | 50.053 |
| 0.23314814814814813 | 50.05 |
| 0.23315972222222223 | 50.049 |
| 0.2331712962962963 | 50.047 |
| 0.23318287037037036 | 50.047 |
| 0.23319444444444445 | 50.047 |
| 0.23320601851851852 | 50.045 |
| 0.2332175925925926 | 50.046 |
| 0.23322916666666668 | 50.047 |
| 0.23324074074074075 | 50.048 |
| 0.23325231481481482 | 50.047 |
| 0.2332638888888889 | 50.047 |
| 0.23327546296296298 | 50.049 |
| 0.23328703703703701 | 50.051 |
| 0.23329861111111114 | 50.055 |
| 0.23331018518518518 | 50.057 |
| 0.23332175925925927 | 50.058 |
| 0.2333333333333333 | 50.059 |
| 0.2333449074074074 | 50.059 |
| 0.23335648148148147 | 50.058 |
| 0.23336805555555554 | 50.056 |
| 0.23337962962962963 | 50.056 |
| 0.2333912037037037 | 50.056 |
| 0.23340277777777776 | 50.057 |
| 0.23341435185185186 | 50.059 |
| 0.23342592592592593 | 50.059 |
| 0.2334375 | 50.06 |
| 0.2334490740740741 | 50.06 |
| 0.23346064814814815 | 50.062 |
| 0.23347222222222222 | 50.062 |
| 0.23348379629629631 | 50.063 |
| 0.23349537037037038 | 50.063 |
| 0.23350694444444445 | 50.063 |
| 0.23351851851851854 | 50.064 |
| 0.23353009259259258 | 50.061 |
| 0.23354166666666668 | 50.059 |
| 0.23355324074074071 | 50.058 |
| 0.23356481481481484 | 50.057 |
| 0.23357638888888888 | 50.055 |
| 0.23358796296296294 | 50.053 |
| 0.23359953703703704 | 50.052 |
| 0.2336111111111111 | 50.052 |
| 0.23362268518518517 | 50.052 |
| 0.23363425925925926 | 50.051 |
| 0.23364583333333333 | 50.05 |
| 0.2336574074074074 | 50.05 |
| 0.2336689814814815 | 50.051 |
| 0.23368055555555556 | 50.053 |
| 0.23369212962962962 | 50.052 |
| 0.23370370370370372 | 50.055 |
| 0.23371527777777779 | 50.056 |
| 0.23372685185185185 | 50.059 |
| 0.23373842592592595 | 50.061 |
| 0.23375 | 50.065 |
| 0.23376157407407408 | 50.068 |
| 0.23377314814814812 | 50.073 |
| 0.23378472222222224 | 50.074 |
| 0.23379629629629628 | 50.077 |
| 0.23380787037037035 | 50.076 |
| 0.23381944444444444 | 50.077 |
| 0.2338310185185185 | 50.075 |
| 0.23384259259259257 | 50.074 |
| 0.23385416666666667 | 50.074 |
| 0.23386574074074074 | 50.074 |
| 0.2338773148148148 | 50.076 |
| 0.2338888888888889 | 50.077 |
| 0.23390046296296296 | 50.077 |
| 0.23391203703703703 | 50.077 |
| 0.23392361111111112 | 50.077 |
| 0.2339351851851852 | 50.076 |
| 0.23394675925925926 | 50.078 |
| 0.23395833333333335 | 50.078 |
| 0.23396990740740742 | 50.078 |
| 0.23398148148148148 | 50.08 |
| 0.23399305555555558 | 50.083 |
| 0.23400462962962965 | 50.081 |
| 0.23401620370370368 | 50.082 |
| 0.2340277777777778 | 50.08 |
| 0.23403935185185185 | 50.078 |
| 0.2340509259259259 | 50.077 |
| 0.23406249999999998 | 50.078 |
| 0.23407407407407407 | 50.078 |
| 0.23408564814814814 | 50.079 |
| 0.2340972222222222 | 50.078 |
| 0.2341087962962963 | 50.078 |
| 0.23412037037037037 | 50.076 |
| 0.23413194444444443 | 50.075 |
| 0.23414351851851853 | 50.073 |
| 0.2341550925925926 | 50.072 |
| 0.23416666666666666 | 50.071 |
| 0.23417824074074076 | 50.07 |
| 0.23418981481481482 | 50.07 |
| 0.2342013888888889 | 50.069 |
| 0.23421296296296298 | 50.07 |
| 0.23422453703703705 | 50.071 |
| 0.2342361111111111 | 50.071 |
| 0.2342476851851852 | 50.072 |
| 0.23425925925925925 | 50.072 |
| 0.23427083333333334 | 50.071 |
| 0.23428240740740738 | 50.072 |
| 0.23429398148148148 | 50.072 |
| 0.23430555555555554 | 50.074 |
| 0.2343171296296296 | 50.075 |
| 0.2343287037037037 | 50.076 |
| 0.23434027777777777 | 50.077 |
| 0.23435185185185184 | 50.077 |
| 0.23436342592592593 | 50.077 |
| 0.234375 | 50.075 |
| 0.23438657407407407 | 50.075 |
| 0.23439814814814816 | 50.076 |
| 0.23440972222222223 | 50.077 |
| 0.2344212962962963 | 50.079 |
| 0.2344328703703704 | 50.081 |
| 0.23444444444444446 | 50.083 |
| 0.23445601851851852 | 50.083 |
| 0.23446759259259262 | 50.083 |
| 0.23447916666666666 | 50.083 |
| 0.23449074074074075 | 50.083 |
| 0.2345023148148148 | 50.082 |
| 0.2345138888888889 | 50.08 |
| 0.23452546296296295 | 50.078 |
| 0.23453703703703702 | 50.076 |
| 0.2345486111111111 | 50.075 |
| 0.23456018518518518 | 50.073 |
| 0.23457175925925924 | 50.072 |
| 0.23458333333333334 | 50.07 |
| 0.2345949074074074 | 50.068 |
| 0.23460648148148147 | 50.068 |
| 0.23461805555555557 | 50.069 |
| 0.23462962962962963 | 50.068 |
| 0.2346412037037037 | 50.067 |
| 0.2346527777777778 | 50.066 |
| 0.23466435185185186 | 50.067 |
| 0.23467592592592593 | 50.067 |
| 0.23468750000000002 | 50.064 |
| 0.2346990740740741 | 50.061 |
| 0.23471064814814815 | 50.058 |
| 0.2347222222222222 | 50.055 |
| 0.23473379629629632 | 50.052 |
| 0.23474537037037035 | 50.05 |
| 0.23475694444444442 | 50.052 |
| 0.23476851851851852 | 50.053 |
| 0.23478009259259258 | 50.054 |
| 0.23479166666666665 | 50.057 |
| 0.23480324074074074 | 50.06 |
| 0.2348148148148148 | 50.061 |
| 0.23482638888888888 | 50.063 |
| 0.23483796296296297 | 50.066 |
| 0.23484953703703704 | 50.067 |
| 0.2348611111111111 | 50.066 |
| 0.2348726851851852 | 50.067 |
| 0.23488425925925926 | 50.069 |
| 0.23489583333333333 | 50.07 |
| 0.23490740740740743 | 50.07 |
| 0.2349189814814815 | 50.07 |
| 0.23493055555555556 | 50.071 |
| 0.23494212962962965 | 50.071 |
| 0.23495370370370372 | 50.071 |
| 0.23496527777777776 | 50.069 |
| 0.23497685185185188 | 50.068 |
| 0.23498842592592592 | 50.066 |
| 0.235 | 50.063 |
| 0.23501157407407405 | 50.059 |
| 0.23502314814814815 | 50.058 |
| 0.23503472222222221 | 50.058 |
| 0.23504629629629628 | 50.056 |
| 0.23505787037037038 | 50.055 |
| 0.23506944444444444 | 50.054 |
| 0.2350810185185185 | 50.053 |
| 0.2350925925925926 | 50.052 |
| 0.23510416666666667 | 50.053 |
| 0.23511574074074074 | 50.052 |
| 0.23512731481481483 | 50.054 |
| 0.2351388888888889 | 50.054 |
| 0.23515046296296296 | 50.054 |
| 0.23516203703703706 | 50.055 |
| 0.23517361111111112 | 50.053 |
| 0.23518518518518516 | 50.051 |
| 0.23519675925925929 | 50.049 |
| 0.23520833333333332 | 50.047 |
| 0.23521990740740742 | 50.045 |
| 0.23523148148148146 | 50.043 |
| 0.23524305555555555 | 50.042 |
| 0.23525462962962962 | 50.041 |
| 0.23526620370370369 | 50.041 |
| 0.23527777777777778 | 50.043 |
| 0.23528935185185185 | 50.042 |
| 0.2353009259259259 | 50.044 |
| 0.2353125 | 50.045 |
| 0.23532407407407407 | 50.047 |
| 0.23533564814814814 | 50.051 |
| 0.23534722222222224 | 50.054 |
| 0.2353587962962963 | 50.055 |
| 0.23537037037037037 | 50.057 |
| 0.23538194444444446 | 50.058 |
| 0.23539351851851853 | 50.057 |
| 0.2354050925925926 | 50.056 |
| 0.2354166666666667 | 50.053 |
| 0.23542824074074073 | 50.05 |
| 0.23543981481481482 | 50.049 |
| 0.23545138888888886 | 50.049 |
| 0.23546296296296299 | 50.048 |
| 0.23547453703703702 | 50.048 |
| 0.2354861111111111 | 50.049 |
| 0.23549768518518518 | 50.048 |
| 0.23550925925925925 | 50.05 |
| 0.23552083333333332 | 50.05 |
| 0.2355324074074074 | 50.047 |
| 0.23554398148148148 | 50.047 |
| 0.23555555555555555 | 50.043 |
| 0.23556712962962964 | 50.04 |
| 0.2355787037037037 | 50.038 |
| 0.23559027777777777 | 50.039 |
| 0.23560185185185187 | 50.039 |
| 0.23561342592592593 | 50.04 |
| 0.235625 | 50.041 |
| 0.2356365740740741 | 50.041 |
| 0.23564814814814816 | 50.04 |
| 0.23565972222222223 | 50.04 |
| 0.23567129629629627 | 50.039 |
| 0.2356828703703704 | 50.036 |
| 0.23569444444444443 | 50.035 |
| 0.2357060185185185 | 50.032 |
| 0.2357175925925926 | 50.031 |
| 0.23572916666666666 | 50.031 |
| 0.23574074074074072 | 50.03 |
| 0.23575231481481482 | 50.027 |
| 0.23576388888888888 | 50.025 |
| 0.23577546296296295 | 50.027 |
| 0.23578703703703704 | 50.026 |
| 0.2357986111111111 | 50.026 |
| 0.23581018518518518 | 50.028 |
| 0.23582175925925927 | 50.029 |
| 0.23583333333333334 | 50.031 |
| 0.2358449074074074 | 50.031 |
| 0.2358564814814815 | 50.033 |
| 0.23586805555555557 | 50.034 |
| 0.23587962962962963 | 50.035 |
| 0.23589120370370367 | 50.036 |
| 0.2359027777777778 | 50.035 |
| 0.23591435185185183 | 50.035 |
| 0.23592592592592596 | 50.035 |
| 0.2359375 | 50.035 |
| 0.23594907407407406 | 50.036 |
| 0.23596064814814813 | 50.036 |
| 0.23597222222222222 | 50.037 |
| 0.2359837962962963 | 50.039 |
| 0.23599537037037036 | 50.039 |
| 0.23600694444444445 | 50.039 |
| 0.23601851851851852 | 50.037 |
| 0.23603009259259258 | 50.035 |
| 0.23604166666666668 | 50.033 |
| 0.23605324074074074 | 50.03 |
| 0.2360648148148148 | 50.028 |
| 0.2360763888888889 | 50.025 |
| 0.23608796296296297 | 50.025 |
| 0.23609953703703704 | 50.024 |
| 0.23611111111111113 | 50.022 |
| 0.2361226851851852 | 50.019 |
| 0.23613425925925924 | 50.017 |
| 0.23614583333333336 | 50.016 |
| 0.2361574074074074 | 50.014 |
| 0.2361689814814815 | 50.013 |
| 0.23618055555555553 | 50.012 |
| 0.23619212962962963 | 50.015 |
| 0.2362037037037037 | 50.017 |
| 0.23621527777777776 | 50.02 |
| 0.23622685185185185 | 50.023 |
| 0.23623842592592592 | 50.025 |
| 0.23625 | 50.028 |
| 0.23626157407407408 | 50.029 |
| 0.23627314814814815 | 50.032 |
| 0.23628472222222222 | 50.033 |
| 0.2362962962962963 | 50.033 |
| 0.23630787037037038 | 50.033 |
| 0.23631944444444444 | 50.034 |
| 0.23633101851851854 | 50.031 |
| 0.2363425925925926 | 50.032 |
| 0.23635416666666667 | 50.031 |
| 0.23636574074074077 | 50.03 |
| 0.2363773148148148 | 50.031 |
| 0.2363888888888889 | 50.03 |
| 0.23640046296296294 | 50.027 |
| 0.23641203703703703 | 50.025 |
| 0.2364236111111111 | 50.023 |
| 0.23643518518518516 | 50.02 |
| 0.23644675925925926 | 50.02 |
| 0.23645833333333333 | 50.019 |
| 0.2364699074074074 | 50.02 |
| 0.2364814814814815 | 50.019 |
| 0.23649305555555555 | 50.019 |
| 0.23650462962962962 | 50.022 |
| 0.23651620370370371 | 50.019 |
| 0.23652777777777778 | 50.018 |
| 0.23653935185185185 | 50.018 |
| 0.23655092592592594 | 50.019 |
| 0.2365625 | 50.019 |
| 0.23657407407407408 | 50.02 |
| 0.23658564814814817 | 50.021 |
| 0.23659722222222224 | 50.022 |
| 0.2366087962962963 | 50.022 |
| 0.23662037037037034 | 50.023 |
| 0.23663194444444446 | 50.02 |
| 0.2366435185185185 | 50.021 |
| 0.23665509259259257 | 50.019 |
| 0.23666666666666666 | 50.016 |
| 0.23667824074074073 | 50.013 |
| 0.2366898148148148 | 50.012 |
| 0.2367013888888889 | 50.011 |
| 0.23671296296296296 | 50.012 |
| 0.23672453703703702 | 50.011 |
| 0.23673611111111112 | 50.011 |
| 0.23674768518518519 | 50.011 |
| 0.23675925925925925 | 50.009 |
| 0.23677083333333335 | 50.009 |
| 0.2367824074074074 | 50.007 |
| 0.23679398148148148 | 50.005 |
| 0.23680555555555557 | 50.002 |
| 0.23681712962962964 | 49.998 |
| 0.2368287037037037 | 49.996 |
| 0.23684027777777775 | 49.991 |
| 0.23685185185185187 | 49.99 |
| 0.2368634259259259 | 49.992 |
| 0.23687500000000003 | 49.993 |
| 0.23688657407407407 | 49.993 |
| 0.23689814814814814 | 49.993 |
| 0.2369097222222222 | 49.993 |
| 0.2369212962962963 | 49.993 |
| 0.23693287037037036 | 49.99 |
| 0.23694444444444443 | 49.99 |
| 0.23695601851851852 | 49.988 |
| 0.2369675925925926 | 49.985 |
| 0.23697916666666666 | 49.984 |
| 0.23699074074074075 | 49.983 |
| 0.23700231481481482 | 49.982 |
| 0.23701388888888889 | 49.98 |
| 0.23702546296296298 | 49.981 |
| 0.23703703703703705 | 49.981 |
| 0.2370486111111111 | 49.982 |
| 0.2370601851851852 | 49.982 |
| 0.23707175925925927 | 49.984 |
| 0.2370833333333333 | 49.986 |
| 0.23709490740740743 | 49.988 |
| 0.23710648148148147 | 49.988 |
| 0.23711805555555557 | 49.99 |
| 0.2371296296296296 | 49.993 |
| 0.2371412037037037 | 49.995 |
| 0.23715277777777777 | 49.997 |
| 0.23716435185185183 | 50.002 |
| 0.23717592592592593 | 50.008 |
| 0.2371875 | 50.014 |
| 0.23719907407407406 | 50.019 |
| 0.23721064814814816 | 50.02 |
| 0.23722222222222222 | 50.021 |
| 0.2372337962962963 | 50.02 |
| 0.23724537037037038 | 50.017 |
| 0.23725694444444445 | 50.015 |
| 0.23726851851851852 | 50.013 |
| 0.2372800925925926 | 50.015 |
| 0.23729166666666668 | 50.015 |
| 0.23730324074074075 | 50.016 |
| 0.23731481481481484 | 50.015 |
| 0.23732638888888888 | 50.015 |
| 0.23733796296296297 | 50.015 |
| 0.237349537037037 | 50.015 |
| 0.2373611111111111 | 50.015 |
| 0.23737268518518517 | 50.014 |
| 0.23738425925925924 | 50.014 |
| 0.23739583333333333 | 50.014 |
| 0.2374074074074074 | 50.014 |
| 0.23741898148148147 | 50.012 |
| 0.23743055555555556 | 50.012 |
| 0.23744212962962963 | 50.013 |
| 0.2374537037037037 | 50.014 |
| 0.2374652777777778 | 50.017 |
| 0.23747685185185186 | 50.018 |
| 0.23748842592592592 | 50.018 |